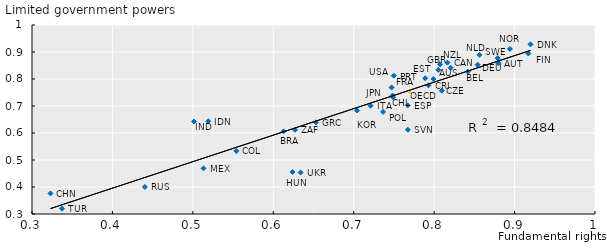
| Category | Series 0 |
|---|---|
| 0.919841607352113 | 0.928 |
| 0.9170658185401639 | 0.895 |
| 0.8942196158777572 | 0.911 |
| 0.8799712194334901 | 0.858 |
| 0.8789145461886119 | 0.877 |
| 0.8562900435019009 | 0.89 |
| 0.8541015764891878 | 0.853 |
| 0.8419377771533879 | 0.828 |
| 0.8204727093676736 | 0.842 |
| 0.8165164049984384 | 0.861 |
| 0.8095477546695812 | 0.757 |
| 0.8074185332980026 | 0.854 |
| 0.8051744686640078 | 0.834 |
| 0.799077946651965 | 0.8 |
| 0.7929894305033381 | 0.776 |
| 0.7889492724047226 | 0.803 |
| 0.77 | 0.75 |
| 0.7673752975805592 | 0.612 |
| 0.7671277973154668 | 0.702 |
| 0.749796404266741 | 0.812 |
| 0.7489101342843772 | 0.732 |
| 0.7483538798998137 | 0.739 |
| 0.7471526491329498 | 0.769 |
| 0.7364872994162097 | 0.678 |
| 0.7210682534530286 | 0.701 |
| 0.7042677190744211 | 0.683 |
| 0.6529652367307716 | 0.639 |
| 0.633952293779797 | 0.454 |
| 0.627000458735066 | 0.612 |
| 0.6239044606253107 | 0.456 |
| 0.6128033060645302 | 0.606 |
| 0.5540266018864681 | 0.534 |
| 0.5191566080247811 | 0.644 |
| 0.513269308411827 | 0.469 |
| 0.501507446612481 | 0.643 |
| 0.4403549523520784 | 0.4 |
| 0.33735962227226 | 0.32 |
| 0.3229937708967095 | 0.376 |